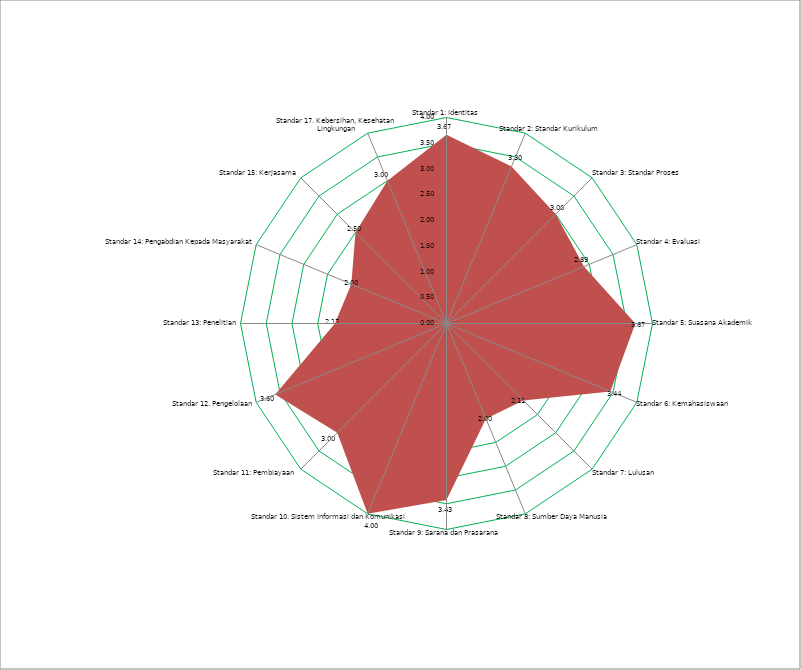
| Category | Series 0 |
|---|---|
| Standar 1: Identitas | 3.667 |
| Standar 2: Standar Kurikulum | 3.3 |
| Standar 3: Standar Proses | 3 |
| Standar 4: Evaluasi | 2.889 |
| Standar 5: Suasana Akademik | 3.667 |
| Standar 6: Kemahasiswaan | 3.444 |
| Standar 7: Lulusan  | 2.111 |
| Standar 8: Sumber Daya Manusia | 2 |
| Standar 9: Sarana dan Prasarana  | 3.429 |
| Standar 10. Sistem Informasi dan Komunikasi | 4 |
| Standar 11: Pembiayaan  | 3 |
| Standar 12. Pengelolaan | 3.6 |
| Standar 13: Penelitian | 2.167 |
| Standar 14: Pengabdian Kepada Masyarakat | 2 |
| Standar 15: Kerjasama  | 2.5 |
| Standar 17. Kebersihan, Kesehatan  Lingkungan | 3 |